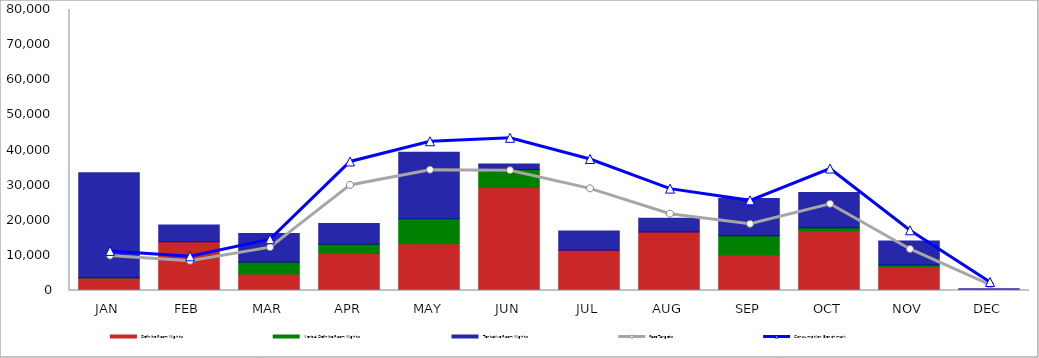
| Category | Definite Room Nights | Verbal Definite Room Nights | Tentative Room Nights |
|---|---|---|---|
| JAN | 3541 | 60 | 29942 |
| FEB | 13900 | 0 | 4719 |
| MAR | 4697 | 3341 | 8210 |
| APR | 10607 | 2560 | 5942 |
| MAY | 13343 | 7049 | 18965 |
| JUN | 29403 | 5038 | 1592 |
| JUL | 11473 | 0 | 5435 |
| AUG | 16663 | 0 | 3911 |
| SEP | 10108 | 5505 | 10579 |
| OCT | 16978 | 875 | 10013 |
| NOV | 6788 | 450 | 6852 |
| DEC | 150 | 0 | 350 |